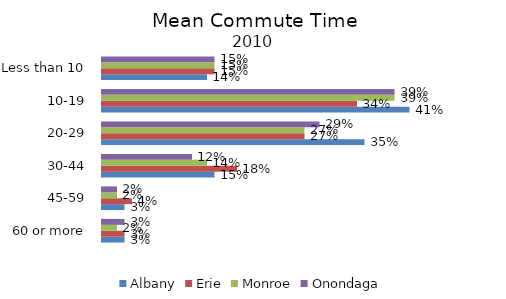
| Category | Albany | Erie | Monroe | Onondaga |
|---|---|---|---|---|
| 60 or more | 0.03 | 0.03 | 0.02 | 0.03 |
| 45-59 | 0.03 | 0.04 | 0.02 | 0.02 |
| 30-44 | 0.15 | 0.18 | 0.14 | 0.12 |
| 20-29 | 0.35 | 0.27 | 0.27 | 0.29 |
| 10-19 | 0.41 | 0.34 | 0.39 | 0.39 |
| Less than 10 | 0.14 | 0.15 | 0.15 | 0.15 |